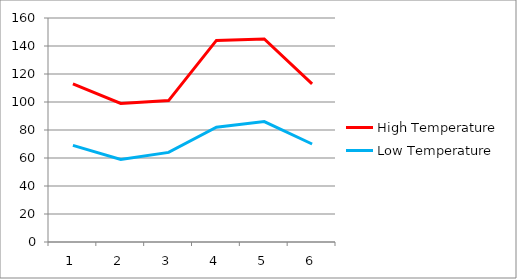
| Category | Low Temperature | High Temperature |
|---|---|---|
| 0 | 69 | 44 |
| 1 | 59 | 40 |
| 2 | 64 | 37 |
| 3 | 82 | 62 |
| 4 | 86 | 59 |
| 5 | 70 | 43 |